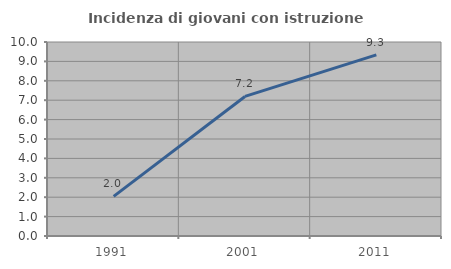
| Category | Incidenza di giovani con istruzione universitaria |
|---|---|
| 1991.0 | 2.041 |
| 2001.0 | 7.194 |
| 2011.0 | 9.333 |